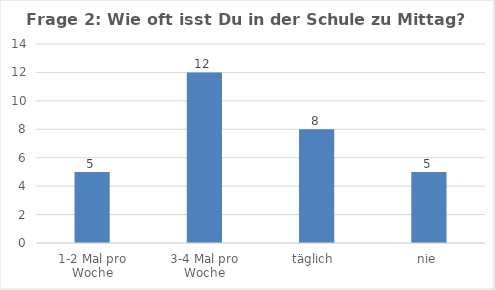
| Category | Series 0 |
|---|---|
| 1-2 Mal pro Woche | 5 |
| 3-4 Mal pro Woche | 12 |
| täglich  | 8 |
| nie | 5 |